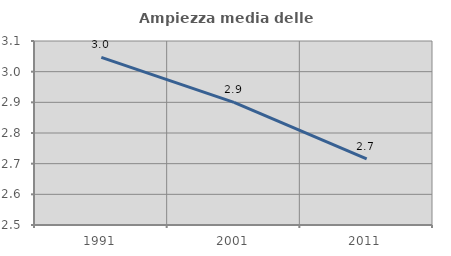
| Category | Ampiezza media delle famiglie |
|---|---|
| 1991.0 | 3.046 |
| 2001.0 | 2.9 |
| 2011.0 | 2.715 |